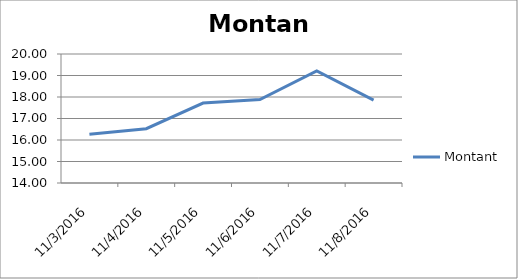
| Category | Montant |
|---|---|
| 2016-11-03 | 16.269 |
| 2016-11-04 | 16.525 |
| 2016-11-05 | 17.717 |
| 2016-11-06 | 17.881 |
| 2016-11-07 | 19.217 |
| 2016-11-08 | 17.855 |